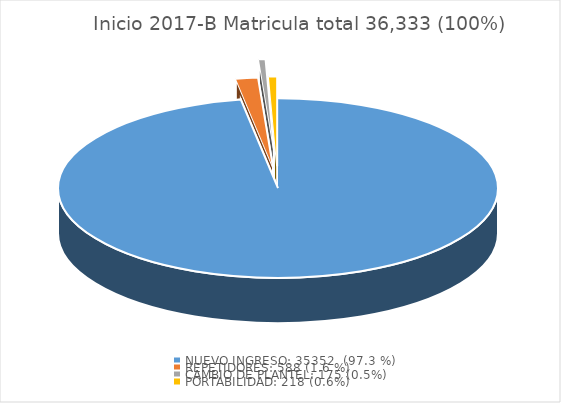
| Category | Series 0 |
|---|---|
| NUEVO INGRESO: 35352  (97.3 %) | 97.3 |
| REPETIDORES: 588 (1.6 %) | 1.618 |
| CAMBIO DE PLANTEL: 175 (0.5%)  | 0.482 |
| PORTABILIDAD: 218 (0.6%) | 0.6 |